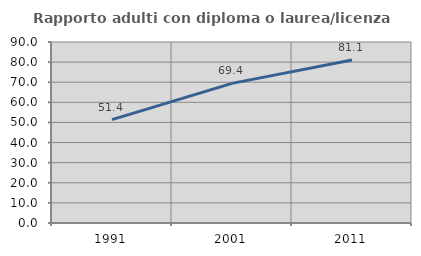
| Category | Rapporto adulti con diploma o laurea/licenza media  |
|---|---|
| 1991.0 | 51.386 |
| 2001.0 | 69.42 |
| 2011.0 | 81.086 |